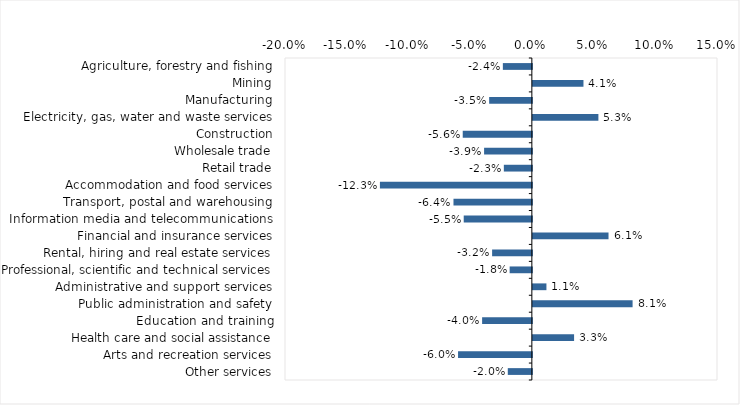
| Category | This week |
|---|---|
| Agriculture, forestry and fishing | -0.024 |
| Mining | 0.041 |
| Manufacturing | -0.035 |
| Electricity, gas, water and waste services | 0.053 |
| Construction | -0.056 |
| Wholesale trade | -0.039 |
| Retail trade | -0.023 |
| Accommodation and food services | -0.123 |
| Transport, postal and warehousing | -0.064 |
| Information media and telecommunications | -0.055 |
| Financial and insurance services | 0.061 |
| Rental, hiring and real estate services | -0.032 |
| Professional, scientific and technical services | -0.018 |
| Administrative and support services | 0.011 |
| Public administration and safety | 0.081 |
| Education and training | -0.04 |
| Health care and social assistance | 0.033 |
| Arts and recreation services | -0.06 |
| Other services | -0.02 |